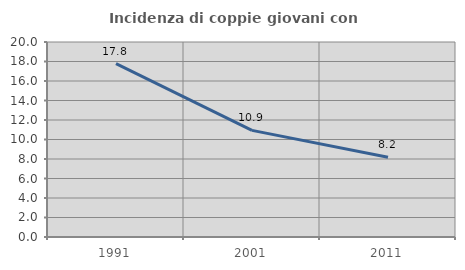
| Category | Incidenza di coppie giovani con figli |
|---|---|
| 1991.0 | 17.782 |
| 2001.0 | 10.938 |
| 2011.0 | 8.176 |